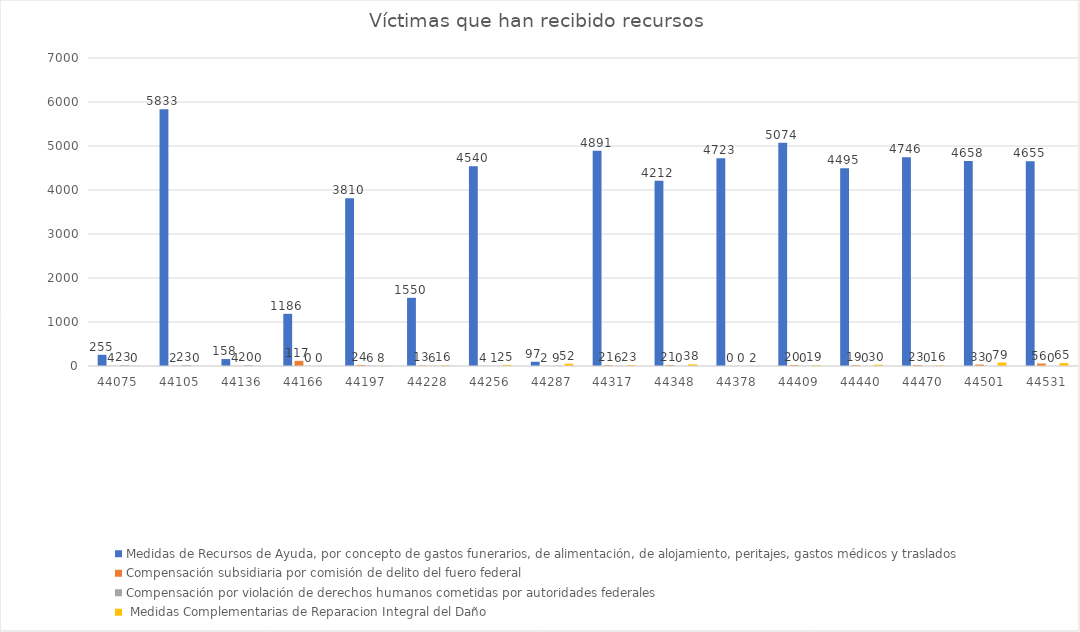
| Category | Medidas de Recursos de Ayuda, por concepto de gastos funerarios, de alimentación, de alojamiento, peritajes, gastos médicos y traslados | Compensación subsidiaria por comisión de delito del fuero federal | Compensación por violación de derechos humanos cometidas por autoridades federales |  Medidas Complementarias de Reparacion Integral del Daño |
|---|---|---|---|---|
| 44075.0 | 255 | 4 | 23 | 0 |
| 44105.0 | 5833 | 2 | 23 | 0 |
| 44136.0 | 158 | 4 | 20 | 0 |
| 44166.0 | 1186 | 117 | 0 | 0 |
| 44197.0 | 3810 | 24 | 6 | 8 |
| 44228.0 | 1550 | 13 | 6 | 16 |
| 44256.0 | 4540 | 4 | 1 | 25 |
| 44287.0 | 97 | 2 | 9 | 52 |
| 44317.0 | 4891 | 21 | 6 | 23 |
| 44348.0 | 4212 | 21 | 0 | 38 |
| 44378.0 | 4723 | 0 | 0 | 2 |
| 44409.0 | 5074 | 20 | 0 | 19 |
| 44440.0 | 4495 | 19 | 0 | 30 |
| 44470.0 | 4746 | 23 | 0 | 16 |
| 44501.0 | 4658 | 33 | 0 | 79 |
| 44531.0 | 4655 | 56 | 0 | 65 |